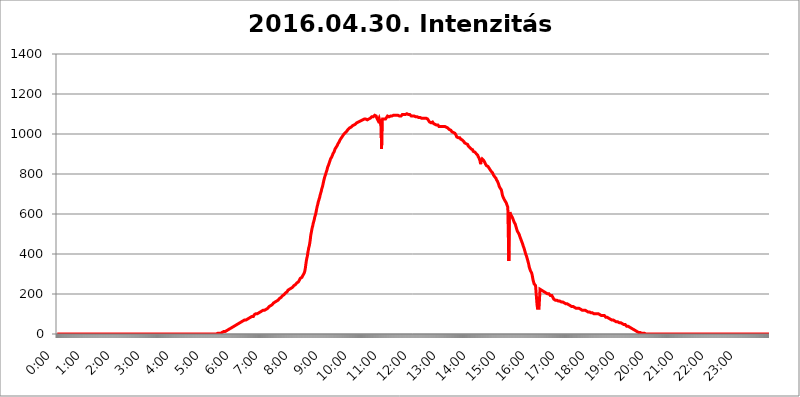
| Category | 2016.04.30. Intenzitás [W/m^2] |
|---|---|
| 0.0 | 0 |
| 0.0006944444444444445 | 0 |
| 0.001388888888888889 | 0 |
| 0.0020833333333333333 | 0 |
| 0.002777777777777778 | 0 |
| 0.003472222222222222 | 0 |
| 0.004166666666666667 | 0 |
| 0.004861111111111111 | 0 |
| 0.005555555555555556 | 0 |
| 0.0062499999999999995 | 0 |
| 0.006944444444444444 | 0 |
| 0.007638888888888889 | 0 |
| 0.008333333333333333 | 0 |
| 0.009027777777777779 | 0 |
| 0.009722222222222222 | 0 |
| 0.010416666666666666 | 0 |
| 0.011111111111111112 | 0 |
| 0.011805555555555555 | 0 |
| 0.012499999999999999 | 0 |
| 0.013194444444444444 | 0 |
| 0.013888888888888888 | 0 |
| 0.014583333333333332 | 0 |
| 0.015277777777777777 | 0 |
| 0.015972222222222224 | 0 |
| 0.016666666666666666 | 0 |
| 0.017361111111111112 | 0 |
| 0.018055555555555557 | 0 |
| 0.01875 | 0 |
| 0.019444444444444445 | 0 |
| 0.02013888888888889 | 0 |
| 0.020833333333333332 | 0 |
| 0.02152777777777778 | 0 |
| 0.022222222222222223 | 0 |
| 0.02291666666666667 | 0 |
| 0.02361111111111111 | 0 |
| 0.024305555555555556 | 0 |
| 0.024999999999999998 | 0 |
| 0.025694444444444447 | 0 |
| 0.02638888888888889 | 0 |
| 0.027083333333333334 | 0 |
| 0.027777777777777776 | 0 |
| 0.02847222222222222 | 0 |
| 0.029166666666666664 | 0 |
| 0.029861111111111113 | 0 |
| 0.030555555555555555 | 0 |
| 0.03125 | 0 |
| 0.03194444444444445 | 0 |
| 0.03263888888888889 | 0 |
| 0.03333333333333333 | 0 |
| 0.034027777777777775 | 0 |
| 0.034722222222222224 | 0 |
| 0.035416666666666666 | 0 |
| 0.036111111111111115 | 0 |
| 0.03680555555555556 | 0 |
| 0.0375 | 0 |
| 0.03819444444444444 | 0 |
| 0.03888888888888889 | 0 |
| 0.03958333333333333 | 0 |
| 0.04027777777777778 | 0 |
| 0.04097222222222222 | 0 |
| 0.041666666666666664 | 0 |
| 0.042361111111111106 | 0 |
| 0.04305555555555556 | 0 |
| 0.043750000000000004 | 0 |
| 0.044444444444444446 | 0 |
| 0.04513888888888889 | 0 |
| 0.04583333333333334 | 0 |
| 0.04652777777777778 | 0 |
| 0.04722222222222222 | 0 |
| 0.04791666666666666 | 0 |
| 0.04861111111111111 | 0 |
| 0.049305555555555554 | 0 |
| 0.049999999999999996 | 0 |
| 0.05069444444444445 | 0 |
| 0.051388888888888894 | 0 |
| 0.052083333333333336 | 0 |
| 0.05277777777777778 | 0 |
| 0.05347222222222222 | 0 |
| 0.05416666666666667 | 0 |
| 0.05486111111111111 | 0 |
| 0.05555555555555555 | 0 |
| 0.05625 | 0 |
| 0.05694444444444444 | 0 |
| 0.057638888888888885 | 0 |
| 0.05833333333333333 | 0 |
| 0.05902777777777778 | 0 |
| 0.059722222222222225 | 0 |
| 0.06041666666666667 | 0 |
| 0.061111111111111116 | 0 |
| 0.06180555555555556 | 0 |
| 0.0625 | 0 |
| 0.06319444444444444 | 0 |
| 0.06388888888888888 | 0 |
| 0.06458333333333334 | 0 |
| 0.06527777777777778 | 0 |
| 0.06597222222222222 | 0 |
| 0.06666666666666667 | 0 |
| 0.06736111111111111 | 0 |
| 0.06805555555555555 | 0 |
| 0.06874999999999999 | 0 |
| 0.06944444444444443 | 0 |
| 0.07013888888888889 | 0 |
| 0.07083333333333333 | 0 |
| 0.07152777777777779 | 0 |
| 0.07222222222222223 | 0 |
| 0.07291666666666667 | 0 |
| 0.07361111111111111 | 0 |
| 0.07430555555555556 | 0 |
| 0.075 | 0 |
| 0.07569444444444444 | 0 |
| 0.0763888888888889 | 0 |
| 0.07708333333333334 | 0 |
| 0.07777777777777778 | 0 |
| 0.07847222222222222 | 0 |
| 0.07916666666666666 | 0 |
| 0.0798611111111111 | 0 |
| 0.08055555555555556 | 0 |
| 0.08125 | 0 |
| 0.08194444444444444 | 0 |
| 0.08263888888888889 | 0 |
| 0.08333333333333333 | 0 |
| 0.08402777777777777 | 0 |
| 0.08472222222222221 | 0 |
| 0.08541666666666665 | 0 |
| 0.08611111111111112 | 0 |
| 0.08680555555555557 | 0 |
| 0.08750000000000001 | 0 |
| 0.08819444444444445 | 0 |
| 0.08888888888888889 | 0 |
| 0.08958333333333333 | 0 |
| 0.09027777777777778 | 0 |
| 0.09097222222222222 | 0 |
| 0.09166666666666667 | 0 |
| 0.09236111111111112 | 0 |
| 0.09305555555555556 | 0 |
| 0.09375 | 0 |
| 0.09444444444444444 | 0 |
| 0.09513888888888888 | 0 |
| 0.09583333333333333 | 0 |
| 0.09652777777777777 | 0 |
| 0.09722222222222222 | 0 |
| 0.09791666666666667 | 0 |
| 0.09861111111111111 | 0 |
| 0.09930555555555555 | 0 |
| 0.09999999999999999 | 0 |
| 0.10069444444444443 | 0 |
| 0.1013888888888889 | 0 |
| 0.10208333333333335 | 0 |
| 0.10277777777777779 | 0 |
| 0.10347222222222223 | 0 |
| 0.10416666666666667 | 0 |
| 0.10486111111111111 | 0 |
| 0.10555555555555556 | 0 |
| 0.10625 | 0 |
| 0.10694444444444444 | 0 |
| 0.1076388888888889 | 0 |
| 0.10833333333333334 | 0 |
| 0.10902777777777778 | 0 |
| 0.10972222222222222 | 0 |
| 0.1111111111111111 | 0 |
| 0.11180555555555556 | 0 |
| 0.11180555555555556 | 0 |
| 0.1125 | 0 |
| 0.11319444444444444 | 0 |
| 0.11388888888888889 | 0 |
| 0.11458333333333333 | 0 |
| 0.11527777777777777 | 0 |
| 0.11597222222222221 | 0 |
| 0.11666666666666665 | 0 |
| 0.1173611111111111 | 0 |
| 0.11805555555555557 | 0 |
| 0.11944444444444445 | 0 |
| 0.12013888888888889 | 0 |
| 0.12083333333333333 | 0 |
| 0.12152777777777778 | 0 |
| 0.12222222222222223 | 0 |
| 0.12291666666666667 | 0 |
| 0.12291666666666667 | 0 |
| 0.12361111111111112 | 0 |
| 0.12430555555555556 | 0 |
| 0.125 | 0 |
| 0.12569444444444444 | 0 |
| 0.12638888888888888 | 0 |
| 0.12708333333333333 | 0 |
| 0.16875 | 0 |
| 0.12847222222222224 | 0 |
| 0.12916666666666668 | 0 |
| 0.12986111111111112 | 0 |
| 0.13055555555555556 | 0 |
| 0.13125 | 0 |
| 0.13194444444444445 | 0 |
| 0.1326388888888889 | 0 |
| 0.13333333333333333 | 0 |
| 0.13402777777777777 | 0 |
| 0.13402777777777777 | 0 |
| 0.13472222222222222 | 0 |
| 0.13541666666666666 | 0 |
| 0.1361111111111111 | 0 |
| 0.13749999999999998 | 0 |
| 0.13819444444444443 | 0 |
| 0.1388888888888889 | 0 |
| 0.13958333333333334 | 0 |
| 0.14027777777777778 | 0 |
| 0.14097222222222222 | 0 |
| 0.14166666666666666 | 0 |
| 0.1423611111111111 | 0 |
| 0.14305555555555557 | 0 |
| 0.14375000000000002 | 0 |
| 0.14444444444444446 | 0 |
| 0.1451388888888889 | 0 |
| 0.1451388888888889 | 0 |
| 0.14652777777777778 | 0 |
| 0.14722222222222223 | 0 |
| 0.14791666666666667 | 0 |
| 0.1486111111111111 | 0 |
| 0.14930555555555555 | 0 |
| 0.15 | 0 |
| 0.15069444444444444 | 0 |
| 0.15138888888888888 | 0 |
| 0.15208333333333332 | 0 |
| 0.15277777777777776 | 0 |
| 0.15347222222222223 | 0 |
| 0.15416666666666667 | 0 |
| 0.15486111111111112 | 0 |
| 0.15555555555555556 | 0 |
| 0.15625 | 0 |
| 0.15694444444444444 | 0 |
| 0.15763888888888888 | 0 |
| 0.15833333333333333 | 0 |
| 0.15902777777777777 | 0 |
| 0.15972222222222224 | 0 |
| 0.16041666666666668 | 0 |
| 0.16111111111111112 | 0 |
| 0.16180555555555556 | 0 |
| 0.1625 | 0 |
| 0.16319444444444445 | 0 |
| 0.1638888888888889 | 0 |
| 0.16458333333333333 | 0 |
| 0.16527777777777777 | 0 |
| 0.16597222222222222 | 0 |
| 0.16666666666666666 | 0 |
| 0.1673611111111111 | 0 |
| 0.16805555555555554 | 0 |
| 0.16874999999999998 | 0 |
| 0.16944444444444443 | 0 |
| 0.17013888888888887 | 0 |
| 0.1708333333333333 | 0 |
| 0.17152777777777775 | 0 |
| 0.17222222222222225 | 0 |
| 0.1729166666666667 | 0 |
| 0.17361111111111113 | 0 |
| 0.17430555555555557 | 0 |
| 0.17500000000000002 | 0 |
| 0.17569444444444446 | 0 |
| 0.1763888888888889 | 0 |
| 0.17708333333333334 | 0 |
| 0.17777777777777778 | 0 |
| 0.17847222222222223 | 0 |
| 0.17916666666666667 | 0 |
| 0.1798611111111111 | 0 |
| 0.18055555555555555 | 0 |
| 0.18125 | 0 |
| 0.18194444444444444 | 0 |
| 0.1826388888888889 | 0 |
| 0.18333333333333335 | 0 |
| 0.1840277777777778 | 0 |
| 0.18472222222222223 | 0 |
| 0.18541666666666667 | 0 |
| 0.18611111111111112 | 0 |
| 0.18680555555555556 | 0 |
| 0.1875 | 0 |
| 0.18819444444444444 | 0 |
| 0.18888888888888888 | 0 |
| 0.18958333333333333 | 0 |
| 0.19027777777777777 | 0 |
| 0.1909722222222222 | 0 |
| 0.19166666666666665 | 0 |
| 0.19236111111111112 | 0 |
| 0.19305555555555554 | 0 |
| 0.19375 | 0 |
| 0.19444444444444445 | 0 |
| 0.1951388888888889 | 0 |
| 0.19583333333333333 | 0 |
| 0.19652777777777777 | 0 |
| 0.19722222222222222 | 0 |
| 0.19791666666666666 | 0 |
| 0.1986111111111111 | 0 |
| 0.19930555555555554 | 0 |
| 0.19999999999999998 | 0 |
| 0.20069444444444443 | 0 |
| 0.20138888888888887 | 0 |
| 0.2020833333333333 | 0 |
| 0.2027777777777778 | 0 |
| 0.2034722222222222 | 0 |
| 0.2041666666666667 | 0 |
| 0.20486111111111113 | 0 |
| 0.20555555555555557 | 0 |
| 0.20625000000000002 | 0 |
| 0.20694444444444446 | 0 |
| 0.2076388888888889 | 0 |
| 0.20833333333333334 | 0 |
| 0.20902777777777778 | 0 |
| 0.20972222222222223 | 0 |
| 0.21041666666666667 | 0 |
| 0.2111111111111111 | 0 |
| 0.21180555555555555 | 0 |
| 0.2125 | 0 |
| 0.21319444444444444 | 0 |
| 0.2138888888888889 | 0 |
| 0.21458333333333335 | 0 |
| 0.2152777777777778 | 0 |
| 0.21597222222222223 | 0 |
| 0.21666666666666667 | 0 |
| 0.21736111111111112 | 0 |
| 0.21805555555555556 | 0 |
| 0.21875 | 0 |
| 0.21944444444444444 | 0 |
| 0.22013888888888888 | 0 |
| 0.22083333333333333 | 0 |
| 0.22152777777777777 | 0 |
| 0.2222222222222222 | 0 |
| 0.22291666666666665 | 0 |
| 0.2236111111111111 | 0 |
| 0.22430555555555556 | 0 |
| 0.225 | 3.525 |
| 0.22569444444444445 | 3.525 |
| 0.2263888888888889 | 3.525 |
| 0.22708333333333333 | 3.525 |
| 0.22777777777777777 | 3.525 |
| 0.22847222222222222 | 3.525 |
| 0.22916666666666666 | 3.525 |
| 0.2298611111111111 | 3.525 |
| 0.23055555555555554 | 7.887 |
| 0.23124999999999998 | 7.887 |
| 0.23194444444444443 | 7.887 |
| 0.23263888888888887 | 12.257 |
| 0.2333333333333333 | 12.257 |
| 0.2340277777777778 | 12.257 |
| 0.2347222222222222 | 12.257 |
| 0.2354166666666667 | 12.257 |
| 0.23611111111111113 | 16.636 |
| 0.23680555555555557 | 16.636 |
| 0.23750000000000002 | 16.636 |
| 0.23819444444444446 | 21.024 |
| 0.2388888888888889 | 21.024 |
| 0.23958333333333334 | 21.024 |
| 0.24027777777777778 | 21.024 |
| 0.24097222222222223 | 25.419 |
| 0.24166666666666667 | 25.419 |
| 0.2423611111111111 | 29.823 |
| 0.24305555555555555 | 29.823 |
| 0.24375 | 29.823 |
| 0.24444444444444446 | 29.823 |
| 0.24513888888888888 | 34.234 |
| 0.24583333333333335 | 34.234 |
| 0.2465277777777778 | 34.234 |
| 0.24722222222222223 | 38.653 |
| 0.24791666666666667 | 38.653 |
| 0.24861111111111112 | 38.653 |
| 0.24930555555555556 | 43.079 |
| 0.25 | 43.079 |
| 0.25069444444444444 | 47.511 |
| 0.2513888888888889 | 47.511 |
| 0.2520833333333333 | 47.511 |
| 0.25277777777777777 | 47.511 |
| 0.2534722222222222 | 51.951 |
| 0.25416666666666665 | 51.951 |
| 0.2548611111111111 | 51.951 |
| 0.2555555555555556 | 56.398 |
| 0.25625000000000003 | 56.398 |
| 0.2569444444444445 | 56.398 |
| 0.2576388888888889 | 56.398 |
| 0.25833333333333336 | 60.85 |
| 0.2590277777777778 | 60.85 |
| 0.25972222222222224 | 65.31 |
| 0.2604166666666667 | 65.31 |
| 0.2611111111111111 | 65.31 |
| 0.26180555555555557 | 65.31 |
| 0.2625 | 69.775 |
| 0.26319444444444445 | 69.775 |
| 0.2638888888888889 | 69.775 |
| 0.26458333333333334 | 69.775 |
| 0.2652777777777778 | 74.246 |
| 0.2659722222222222 | 74.246 |
| 0.26666666666666666 | 74.246 |
| 0.2673611111111111 | 78.722 |
| 0.26805555555555555 | 78.722 |
| 0.26875 | 78.722 |
| 0.26944444444444443 | 83.205 |
| 0.2701388888888889 | 83.205 |
| 0.2708333333333333 | 83.205 |
| 0.27152777777777776 | 83.205 |
| 0.2722222222222222 | 87.692 |
| 0.27291666666666664 | 87.692 |
| 0.2736111111111111 | 87.692 |
| 0.2743055555555555 | 92.184 |
| 0.27499999999999997 | 87.692 |
| 0.27569444444444446 | 92.184 |
| 0.27638888888888885 | 96.682 |
| 0.27708333333333335 | 96.682 |
| 0.2777777777777778 | 96.682 |
| 0.27847222222222223 | 101.184 |
| 0.2791666666666667 | 101.184 |
| 0.2798611111111111 | 101.184 |
| 0.28055555555555556 | 101.184 |
| 0.28125 | 105.69 |
| 0.28194444444444444 | 105.69 |
| 0.2826388888888889 | 105.69 |
| 0.2833333333333333 | 110.201 |
| 0.28402777777777777 | 110.201 |
| 0.2847222222222222 | 110.201 |
| 0.28541666666666665 | 110.201 |
| 0.28611111111111115 | 114.716 |
| 0.28680555555555554 | 114.716 |
| 0.28750000000000003 | 114.716 |
| 0.2881944444444445 | 114.716 |
| 0.2888888888888889 | 119.235 |
| 0.28958333333333336 | 119.235 |
| 0.2902777777777778 | 119.235 |
| 0.29097222222222224 | 119.235 |
| 0.2916666666666667 | 123.758 |
| 0.2923611111111111 | 123.758 |
| 0.29305555555555557 | 123.758 |
| 0.29375 | 128.284 |
| 0.29444444444444445 | 128.284 |
| 0.2951388888888889 | 128.284 |
| 0.29583333333333334 | 132.814 |
| 0.2965277777777778 | 132.814 |
| 0.2972222222222222 | 137.347 |
| 0.29791666666666666 | 137.347 |
| 0.2986111111111111 | 141.884 |
| 0.29930555555555555 | 141.884 |
| 0.3 | 141.884 |
| 0.30069444444444443 | 146.423 |
| 0.3013888888888889 | 146.423 |
| 0.3020833333333333 | 150.964 |
| 0.30277777777777776 | 150.964 |
| 0.3034722222222222 | 155.509 |
| 0.30416666666666664 | 155.509 |
| 0.3048611111111111 | 155.509 |
| 0.3055555555555555 | 160.056 |
| 0.30624999999999997 | 160.056 |
| 0.3069444444444444 | 164.605 |
| 0.3076388888888889 | 164.605 |
| 0.30833333333333335 | 169.156 |
| 0.3090277777777778 | 169.156 |
| 0.30972222222222223 | 169.156 |
| 0.3104166666666667 | 173.709 |
| 0.3111111111111111 | 173.709 |
| 0.31180555555555556 | 178.264 |
| 0.3125 | 178.264 |
| 0.31319444444444444 | 182.82 |
| 0.3138888888888889 | 182.82 |
| 0.3145833333333333 | 187.378 |
| 0.31527777777777777 | 187.378 |
| 0.3159722222222222 | 191.937 |
| 0.31666666666666665 | 191.937 |
| 0.31736111111111115 | 191.937 |
| 0.31805555555555554 | 196.497 |
| 0.31875000000000003 | 201.058 |
| 0.3194444444444445 | 201.058 |
| 0.3201388888888889 | 205.62 |
| 0.32083333333333336 | 205.62 |
| 0.3215277777777778 | 210.182 |
| 0.32222222222222224 | 210.182 |
| 0.3229166666666667 | 214.746 |
| 0.3236111111111111 | 219.309 |
| 0.32430555555555557 | 219.309 |
| 0.325 | 219.309 |
| 0.32569444444444445 | 223.873 |
| 0.3263888888888889 | 223.873 |
| 0.32708333333333334 | 228.436 |
| 0.3277777777777778 | 228.436 |
| 0.3284722222222222 | 228.436 |
| 0.32916666666666666 | 233 |
| 0.3298611111111111 | 233 |
| 0.33055555555555555 | 237.564 |
| 0.33125 | 237.564 |
| 0.33194444444444443 | 242.127 |
| 0.3326388888888889 | 242.127 |
| 0.3333333333333333 | 242.127 |
| 0.3340277777777778 | 246.689 |
| 0.3347222222222222 | 251.251 |
| 0.3354166666666667 | 251.251 |
| 0.3361111111111111 | 255.813 |
| 0.3368055555555556 | 255.813 |
| 0.33749999999999997 | 260.373 |
| 0.33819444444444446 | 260.373 |
| 0.33888888888888885 | 264.932 |
| 0.33958333333333335 | 269.49 |
| 0.34027777777777773 | 274.047 |
| 0.34097222222222223 | 278.603 |
| 0.3416666666666666 | 278.603 |
| 0.3423611111111111 | 283.156 |
| 0.3430555555555555 | 283.156 |
| 0.34375 | 287.709 |
| 0.3444444444444445 | 292.259 |
| 0.3451388888888889 | 292.259 |
| 0.3458333333333334 | 296.808 |
| 0.34652777777777777 | 305.898 |
| 0.34722222222222227 | 314.98 |
| 0.34791666666666665 | 328.584 |
| 0.34861111111111115 | 346.682 |
| 0.34930555555555554 | 364.728 |
| 0.35000000000000003 | 378.224 |
| 0.3506944444444444 | 387.202 |
| 0.3513888888888889 | 405.108 |
| 0.3520833333333333 | 418.492 |
| 0.3527777777777778 | 431.833 |
| 0.3534722222222222 | 440.702 |
| 0.3541666666666667 | 453.968 |
| 0.3548611111111111 | 471.582 |
| 0.35555555555555557 | 493.475 |
| 0.35625 | 506.542 |
| 0.35694444444444445 | 519.555 |
| 0.3576388888888889 | 532.513 |
| 0.35833333333333334 | 541.121 |
| 0.3590277777777778 | 553.986 |
| 0.3597222222222222 | 562.53 |
| 0.36041666666666666 | 571.049 |
| 0.3611111111111111 | 583.779 |
| 0.36180555555555555 | 592.233 |
| 0.3625 | 600.661 |
| 0.36319444444444443 | 613.252 |
| 0.3638888888888889 | 625.784 |
| 0.3645833333333333 | 638.256 |
| 0.3652777777777778 | 646.537 |
| 0.3659722222222222 | 658.909 |
| 0.3666666666666667 | 667.123 |
| 0.3673611111111111 | 675.311 |
| 0.3680555555555556 | 683.473 |
| 0.36874999999999997 | 695.666 |
| 0.36944444444444446 | 703.762 |
| 0.37013888888888885 | 711.832 |
| 0.37083333333333335 | 723.889 |
| 0.37152777777777773 | 731.896 |
| 0.37222222222222223 | 739.877 |
| 0.3729166666666666 | 751.803 |
| 0.3736111111111111 | 763.674 |
| 0.3743055555555555 | 767.62 |
| 0.375 | 783.342 |
| 0.3756944444444445 | 791.169 |
| 0.3763888888888889 | 798.974 |
| 0.3770833333333334 | 806.757 |
| 0.37777777777777777 | 814.519 |
| 0.37847222222222227 | 822.26 |
| 0.37916666666666665 | 833.834 |
| 0.37986111111111115 | 837.682 |
| 0.38055555555555554 | 845.365 |
| 0.38125000000000003 | 853.029 |
| 0.3819444444444444 | 860.676 |
| 0.3826388888888889 | 868.305 |
| 0.3833333333333333 | 875.918 |
| 0.3840277777777778 | 879.719 |
| 0.3847222222222222 | 883.516 |
| 0.3854166666666667 | 887.309 |
| 0.3861111111111111 | 894.885 |
| 0.38680555555555557 | 902.447 |
| 0.3875 | 906.223 |
| 0.38819444444444445 | 909.996 |
| 0.3888888888888889 | 917.534 |
| 0.38958333333333334 | 925.06 |
| 0.3902777777777778 | 925.06 |
| 0.3909722222222222 | 932.576 |
| 0.39166666666666666 | 936.33 |
| 0.3923611111111111 | 940.082 |
| 0.39305555555555555 | 943.832 |
| 0.39375 | 951.327 |
| 0.39444444444444443 | 955.071 |
| 0.3951388888888889 | 958.814 |
| 0.3958333333333333 | 962.555 |
| 0.3965277777777778 | 970.034 |
| 0.3972222222222222 | 973.772 |
| 0.3979166666666667 | 977.508 |
| 0.3986111111111111 | 981.244 |
| 0.3993055555555556 | 984.98 |
| 0.39999999999999997 | 988.714 |
| 0.40069444444444446 | 992.448 |
| 0.40138888888888885 | 996.182 |
| 0.40208333333333335 | 999.916 |
| 0.40277777777777773 | 999.916 |
| 0.40347222222222223 | 1003.65 |
| 0.4041666666666666 | 1007.383 |
| 0.4048611111111111 | 1011.118 |
| 0.4055555555555555 | 1011.118 |
| 0.40625 | 1014.852 |
| 0.4069444444444445 | 1018.587 |
| 0.4076388888888889 | 1022.323 |
| 0.4083333333333334 | 1022.323 |
| 0.40902777777777777 | 1022.323 |
| 0.40972222222222227 | 1029.798 |
| 0.41041666666666665 | 1029.798 |
| 0.41111111111111115 | 1029.798 |
| 0.41180555555555554 | 1033.537 |
| 0.41250000000000003 | 1037.277 |
| 0.4131944444444444 | 1037.277 |
| 0.4138888888888889 | 1041.019 |
| 0.4145833333333333 | 1041.019 |
| 0.4152777777777778 | 1041.019 |
| 0.4159722222222222 | 1044.762 |
| 0.4166666666666667 | 1044.762 |
| 0.4173611111111111 | 1044.762 |
| 0.41805555555555557 | 1048.508 |
| 0.41875 | 1048.508 |
| 0.41944444444444445 | 1052.255 |
| 0.4201388888888889 | 1056.004 |
| 0.42083333333333334 | 1056.004 |
| 0.4215277777777778 | 1059.756 |
| 0.4222222222222222 | 1059.756 |
| 0.42291666666666666 | 1059.756 |
| 0.4236111111111111 | 1063.51 |
| 0.42430555555555555 | 1063.51 |
| 0.425 | 1063.51 |
| 0.42569444444444443 | 1067.267 |
| 0.4263888888888889 | 1067.267 |
| 0.4270833333333333 | 1067.267 |
| 0.4277777777777778 | 1067.267 |
| 0.4284722222222222 | 1071.027 |
| 0.4291666666666667 | 1071.027 |
| 0.4298611111111111 | 1074.789 |
| 0.4305555555555556 | 1074.789 |
| 0.43124999999999997 | 1074.789 |
| 0.43194444444444446 | 1074.789 |
| 0.43263888888888885 | 1074.789 |
| 0.43333333333333335 | 1071.027 |
| 0.43402777777777773 | 1071.027 |
| 0.43472222222222223 | 1071.027 |
| 0.4354166666666666 | 1074.789 |
| 0.4361111111111111 | 1074.789 |
| 0.4368055555555555 | 1074.789 |
| 0.4375 | 1074.789 |
| 0.4381944444444445 | 1074.789 |
| 0.4388888888888889 | 1078.555 |
| 0.4395833333333334 | 1078.555 |
| 0.44027777777777777 | 1078.555 |
| 0.44097222222222227 | 1086.097 |
| 0.44166666666666665 | 1086.097 |
| 0.44236111111111115 | 1086.097 |
| 0.44305555555555554 | 1086.097 |
| 0.44375000000000003 | 1082.324 |
| 0.4444444444444444 | 1086.097 |
| 0.4451388888888889 | 1093.653 |
| 0.4458333333333333 | 1093.653 |
| 0.4465277777777778 | 1093.653 |
| 0.4472222222222222 | 1089.873 |
| 0.4479166666666667 | 1082.324 |
| 0.4486111111111111 | 1082.324 |
| 0.44930555555555557 | 1078.555 |
| 0.45 | 1067.267 |
| 0.45069444444444445 | 1071.027 |
| 0.4513888888888889 | 1078.555 |
| 0.45208333333333334 | 1082.324 |
| 0.4527777777777778 | 1059.756 |
| 0.4534722222222222 | 1059.756 |
| 0.45416666666666666 | 1071.027 |
| 0.4548611111111111 | 925.06 |
| 0.45555555555555555 | 1063.51 |
| 0.45625 | 1074.789 |
| 0.45694444444444443 | 1078.555 |
| 0.4576388888888889 | 1074.789 |
| 0.4583333333333333 | 1074.789 |
| 0.4590277777777778 | 1074.789 |
| 0.4597222222222222 | 1074.789 |
| 0.4604166666666667 | 1074.789 |
| 0.4611111111111111 | 1078.555 |
| 0.4618055555555556 | 1082.324 |
| 0.46249999999999997 | 1086.097 |
| 0.46319444444444446 | 1089.873 |
| 0.46388888888888885 | 1093.653 |
| 0.46458333333333335 | 1086.097 |
| 0.46527777777777773 | 1086.097 |
| 0.46597222222222223 | 1086.097 |
| 0.4666666666666666 | 1089.873 |
| 0.4673611111111111 | 1089.873 |
| 0.4680555555555555 | 1089.873 |
| 0.46875 | 1089.873 |
| 0.4694444444444445 | 1089.873 |
| 0.4701388888888889 | 1093.653 |
| 0.4708333333333334 | 1093.653 |
| 0.47152777777777777 | 1093.653 |
| 0.47222222222222227 | 1093.653 |
| 0.47291666666666665 | 1093.653 |
| 0.47361111111111115 | 1093.653 |
| 0.47430555555555554 | 1097.437 |
| 0.47500000000000003 | 1093.653 |
| 0.4756944444444444 | 1093.653 |
| 0.4763888888888889 | 1093.653 |
| 0.4770833333333333 | 1093.653 |
| 0.4777777777777778 | 1093.653 |
| 0.4784722222222222 | 1089.873 |
| 0.4791666666666667 | 1093.653 |
| 0.4798611111111111 | 1089.873 |
| 0.48055555555555557 | 1086.097 |
| 0.48125 | 1089.873 |
| 0.48194444444444445 | 1089.873 |
| 0.4826388888888889 | 1093.653 |
| 0.48333333333333334 | 1093.653 |
| 0.4840277777777778 | 1097.437 |
| 0.4847222222222222 | 1093.653 |
| 0.48541666666666666 | 1097.437 |
| 0.4861111111111111 | 1097.437 |
| 0.48680555555555555 | 1101.226 |
| 0.4875 | 1097.437 |
| 0.48819444444444443 | 1097.437 |
| 0.4888888888888889 | 1101.226 |
| 0.4895833333333333 | 1101.226 |
| 0.4902777777777778 | 1101.226 |
| 0.4909722222222222 | 1101.226 |
| 0.4916666666666667 | 1097.437 |
| 0.4923611111111111 | 1097.437 |
| 0.4930555555555556 | 1101.226 |
| 0.49374999999999997 | 1097.437 |
| 0.49444444444444446 | 1097.437 |
| 0.49513888888888885 | 1093.653 |
| 0.49583333333333335 | 1093.653 |
| 0.49652777777777773 | 1089.873 |
| 0.49722222222222223 | 1089.873 |
| 0.4979166666666666 | 1089.873 |
| 0.4986111111111111 | 1089.873 |
| 0.4993055555555555 | 1089.873 |
| 0.5 | 1089.873 |
| 0.5006944444444444 | 1089.873 |
| 0.5013888888888889 | 1089.873 |
| 0.5020833333333333 | 1086.097 |
| 0.5027777777777778 | 1086.097 |
| 0.5034722222222222 | 1086.097 |
| 0.5041666666666667 | 1086.097 |
| 0.5048611111111111 | 1086.097 |
| 0.5055555555555555 | 1086.097 |
| 0.50625 | 1082.324 |
| 0.5069444444444444 | 1082.324 |
| 0.5076388888888889 | 1082.324 |
| 0.5083333333333333 | 1082.324 |
| 0.5090277777777777 | 1082.324 |
| 0.5097222222222222 | 1082.324 |
| 0.5104166666666666 | 1082.324 |
| 0.5111111111111112 | 1078.555 |
| 0.5118055555555555 | 1078.555 |
| 0.5125000000000001 | 1078.555 |
| 0.5131944444444444 | 1078.555 |
| 0.513888888888889 | 1082.324 |
| 0.5145833333333333 | 1082.324 |
| 0.5152777777777778 | 1078.555 |
| 0.5159722222222222 | 1082.324 |
| 0.5166666666666667 | 1078.555 |
| 0.517361111111111 | 1078.555 |
| 0.5180555555555556 | 1078.555 |
| 0.5187499999999999 | 1074.789 |
| 0.5194444444444445 | 1074.789 |
| 0.5201388888888888 | 1071.027 |
| 0.5208333333333334 | 1067.267 |
| 0.5215277777777778 | 1063.51 |
| 0.5222222222222223 | 1059.756 |
| 0.5229166666666667 | 1056.004 |
| 0.5236111111111111 | 1056.004 |
| 0.5243055555555556 | 1056.004 |
| 0.525 | 1059.756 |
| 0.5256944444444445 | 1056.004 |
| 0.5263888888888889 | 1059.756 |
| 0.5270833333333333 | 1056.004 |
| 0.5277777777777778 | 1052.255 |
| 0.5284722222222222 | 1048.508 |
| 0.5291666666666667 | 1048.508 |
| 0.5298611111111111 | 1048.508 |
| 0.5305555555555556 | 1048.508 |
| 0.53125 | 1048.508 |
| 0.5319444444444444 | 1044.762 |
| 0.5326388888888889 | 1044.762 |
| 0.5333333333333333 | 1044.762 |
| 0.5340277777777778 | 1044.762 |
| 0.5347222222222222 | 1041.019 |
| 0.5354166666666667 | 1037.277 |
| 0.5361111111111111 | 1037.277 |
| 0.5368055555555555 | 1037.277 |
| 0.5375 | 1037.277 |
| 0.5381944444444444 | 1041.019 |
| 0.5388888888888889 | 1037.277 |
| 0.5395833333333333 | 1037.277 |
| 0.5402777777777777 | 1037.277 |
| 0.5409722222222222 | 1037.277 |
| 0.5416666666666666 | 1037.277 |
| 0.5423611111111112 | 1033.537 |
| 0.5430555555555555 | 1033.537 |
| 0.5437500000000001 | 1037.277 |
| 0.5444444444444444 | 1033.537 |
| 0.545138888888889 | 1033.537 |
| 0.5458333333333333 | 1033.537 |
| 0.5465277777777778 | 1033.537 |
| 0.5472222222222222 | 1029.798 |
| 0.5479166666666667 | 1029.798 |
| 0.548611111111111 | 1029.798 |
| 0.5493055555555556 | 1026.06 |
| 0.5499999999999999 | 1022.323 |
| 0.5506944444444445 | 1022.323 |
| 0.5513888888888888 | 1022.323 |
| 0.5520833333333334 | 1018.587 |
| 0.5527777777777778 | 1014.852 |
| 0.5534722222222223 | 1011.118 |
| 0.5541666666666667 | 1014.852 |
| 0.5548611111111111 | 1007.383 |
| 0.5555555555555556 | 1007.383 |
| 0.55625 | 1007.383 |
| 0.5569444444444445 | 1003.65 |
| 0.5576388888888889 | 1003.65 |
| 0.5583333333333333 | 999.916 |
| 0.5590277777777778 | 996.182 |
| 0.5597222222222222 | 992.448 |
| 0.5604166666666667 | 984.98 |
| 0.5611111111111111 | 984.98 |
| 0.5618055555555556 | 984.98 |
| 0.5625 | 981.244 |
| 0.5631944444444444 | 981.244 |
| 0.5638888888888889 | 977.508 |
| 0.5645833333333333 | 981.244 |
| 0.5652777777777778 | 977.508 |
| 0.5659722222222222 | 973.772 |
| 0.5666666666666667 | 973.772 |
| 0.5673611111111111 | 970.034 |
| 0.5680555555555555 | 970.034 |
| 0.56875 | 970.034 |
| 0.5694444444444444 | 966.295 |
| 0.5701388888888889 | 962.555 |
| 0.5708333333333333 | 958.814 |
| 0.5715277777777777 | 955.071 |
| 0.5722222222222222 | 955.071 |
| 0.5729166666666666 | 951.327 |
| 0.5736111111111112 | 951.327 |
| 0.5743055555555555 | 951.327 |
| 0.5750000000000001 | 947.58 |
| 0.5756944444444444 | 947.58 |
| 0.576388888888889 | 940.082 |
| 0.5770833333333333 | 940.082 |
| 0.5777777777777778 | 936.33 |
| 0.5784722222222222 | 932.576 |
| 0.5791666666666667 | 932.576 |
| 0.579861111111111 | 932.576 |
| 0.5805555555555556 | 925.06 |
| 0.5812499999999999 | 925.06 |
| 0.5819444444444445 | 921.298 |
| 0.5826388888888888 | 921.298 |
| 0.5833333333333334 | 913.766 |
| 0.5840277777777778 | 913.766 |
| 0.5847222222222223 | 913.766 |
| 0.5854166666666667 | 909.996 |
| 0.5861111111111111 | 909.996 |
| 0.5868055555555556 | 906.223 |
| 0.5875 | 902.447 |
| 0.5881944444444445 | 898.668 |
| 0.5888888888888889 | 898.668 |
| 0.5895833333333333 | 894.885 |
| 0.5902777777777778 | 887.309 |
| 0.5909722222222222 | 887.309 |
| 0.5916666666666667 | 879.719 |
| 0.5923611111111111 | 875.918 |
| 0.5930555555555556 | 864.493 |
| 0.59375 | 849.199 |
| 0.5944444444444444 | 868.305 |
| 0.5951388888888889 | 872.114 |
| 0.5958333333333333 | 875.918 |
| 0.5965277777777778 | 872.114 |
| 0.5972222222222222 | 872.114 |
| 0.5979166666666667 | 868.305 |
| 0.5986111111111111 | 864.493 |
| 0.5993055555555555 | 860.676 |
| 0.6 | 856.855 |
| 0.6006944444444444 | 849.199 |
| 0.6013888888888889 | 845.365 |
| 0.6020833333333333 | 841.526 |
| 0.6027777777777777 | 841.526 |
| 0.6034722222222222 | 841.526 |
| 0.6041666666666666 | 837.682 |
| 0.6048611111111112 | 833.834 |
| 0.6055555555555555 | 829.981 |
| 0.6062500000000001 | 829.981 |
| 0.6069444444444444 | 822.26 |
| 0.607638888888889 | 818.392 |
| 0.6083333333333333 | 814.519 |
| 0.6090277777777778 | 810.641 |
| 0.6097222222222222 | 810.641 |
| 0.6104166666666667 | 806.757 |
| 0.611111111111111 | 802.868 |
| 0.6118055555555556 | 795.074 |
| 0.6124999999999999 | 791.169 |
| 0.6131944444444445 | 787.258 |
| 0.6138888888888888 | 783.342 |
| 0.6145833333333334 | 783.342 |
| 0.6152777777777778 | 779.42 |
| 0.6159722222222223 | 771.559 |
| 0.6166666666666667 | 767.62 |
| 0.6173611111111111 | 763.674 |
| 0.6180555555555556 | 759.723 |
| 0.61875 | 751.803 |
| 0.6194444444444445 | 743.859 |
| 0.6201388888888889 | 735.89 |
| 0.6208333333333333 | 735.89 |
| 0.6215277777777778 | 727.896 |
| 0.6222222222222222 | 727.896 |
| 0.6229166666666667 | 719.877 |
| 0.6236111111111111 | 715.858 |
| 0.6243055555555556 | 695.666 |
| 0.625 | 687.544 |
| 0.6256944444444444 | 683.473 |
| 0.6263888888888889 | 683.473 |
| 0.6270833333333333 | 671.22 |
| 0.6277777777777778 | 667.123 |
| 0.6284722222222222 | 663.019 |
| 0.6291666666666667 | 658.909 |
| 0.6298611111111111 | 654.791 |
| 0.6305555555555555 | 646.537 |
| 0.63125 | 642.4 |
| 0.6319444444444444 | 634.105 |
| 0.6326388888888889 | 629.948 |
| 0.6333333333333333 | 364.728 |
| 0.6340277777777777 | 592.233 |
| 0.6347222222222222 | 609.062 |
| 0.6354166666666666 | 600.661 |
| 0.6361111111111112 | 596.45 |
| 0.6368055555555555 | 592.233 |
| 0.6375000000000001 | 588.009 |
| 0.6381944444444444 | 583.779 |
| 0.638888888888889 | 579.542 |
| 0.6395833333333333 | 571.049 |
| 0.6402777777777778 | 566.793 |
| 0.6409722222222222 | 558.261 |
| 0.6416666666666667 | 553.986 |
| 0.642361111111111 | 549.704 |
| 0.6430555555555556 | 541.121 |
| 0.6437499999999999 | 532.513 |
| 0.6444444444444445 | 523.88 |
| 0.6451388888888888 | 515.223 |
| 0.6458333333333334 | 510.885 |
| 0.6465277777777778 | 506.542 |
| 0.6472222222222223 | 506.542 |
| 0.6479166666666667 | 497.836 |
| 0.6486111111111111 | 489.108 |
| 0.6493055555555556 | 484.735 |
| 0.65 | 475.972 |
| 0.6506944444444445 | 471.582 |
| 0.6513888888888889 | 462.786 |
| 0.6520833333333333 | 458.38 |
| 0.6527777777777778 | 449.551 |
| 0.6534722222222222 | 440.702 |
| 0.6541666666666667 | 436.27 |
| 0.6548611111111111 | 427.39 |
| 0.6555555555555556 | 418.492 |
| 0.65625 | 409.574 |
| 0.6569444444444444 | 400.638 |
| 0.6576388888888889 | 396.164 |
| 0.6583333333333333 | 387.202 |
| 0.6590277777777778 | 378.224 |
| 0.6597222222222222 | 369.23 |
| 0.6604166666666667 | 360.221 |
| 0.6611111111111111 | 351.198 |
| 0.6618055555555555 | 337.639 |
| 0.6625 | 328.584 |
| 0.6631944444444444 | 324.052 |
| 0.6638888888888889 | 314.98 |
| 0.6645833333333333 | 310.44 |
| 0.6652777777777777 | 305.898 |
| 0.6659722222222222 | 296.808 |
| 0.6666666666666666 | 283.156 |
| 0.6673611111111111 | 269.49 |
| 0.6680555555555556 | 260.373 |
| 0.6687500000000001 | 251.251 |
| 0.6694444444444444 | 246.689 |
| 0.6701388888888888 | 246.689 |
| 0.6708333333333334 | 242.127 |
| 0.6715277777777778 | 242.127 |
| 0.6722222222222222 | 237.564 |
| 0.6729166666666666 | 146.423 |
| 0.6736111111111112 | 128.284 |
| 0.6743055555555556 | 128.284 |
| 0.6749999999999999 | 132.814 |
| 0.6756944444444444 | 128.284 |
| 0.6763888888888889 | 132.814 |
| 0.6770833333333334 | 223.873 |
| 0.6777777777777777 | 228.436 |
| 0.6784722222222223 | 223.873 |
| 0.6791666666666667 | 219.309 |
| 0.6798611111111111 | 219.309 |
| 0.6805555555555555 | 219.309 |
| 0.68125 | 214.746 |
| 0.6819444444444445 | 214.746 |
| 0.6826388888888889 | 214.746 |
| 0.6833333333333332 | 210.182 |
| 0.6840277777777778 | 210.182 |
| 0.6847222222222222 | 210.182 |
| 0.6854166666666667 | 205.62 |
| 0.686111111111111 | 205.62 |
| 0.6868055555555556 | 205.62 |
| 0.6875 | 201.058 |
| 0.6881944444444444 | 201.058 |
| 0.688888888888889 | 201.058 |
| 0.6895833333333333 | 201.058 |
| 0.6902777777777778 | 196.497 |
| 0.6909722222222222 | 196.497 |
| 0.6916666666666668 | 191.937 |
| 0.6923611111111111 | 191.937 |
| 0.6930555555555555 | 191.937 |
| 0.69375 | 191.937 |
| 0.6944444444444445 | 191.937 |
| 0.6951388888888889 | 182.82 |
| 0.6958333333333333 | 178.264 |
| 0.6965277777777777 | 173.709 |
| 0.6972222222222223 | 173.709 |
| 0.6979166666666666 | 173.709 |
| 0.6986111111111111 | 169.156 |
| 0.6993055555555556 | 169.156 |
| 0.7000000000000001 | 169.156 |
| 0.7006944444444444 | 169.156 |
| 0.7013888888888888 | 164.605 |
| 0.7020833333333334 | 164.605 |
| 0.7027777777777778 | 164.605 |
| 0.7034722222222222 | 164.605 |
| 0.7041666666666666 | 164.605 |
| 0.7048611111111112 | 164.605 |
| 0.7055555555555556 | 164.605 |
| 0.7062499999999999 | 164.605 |
| 0.7069444444444444 | 160.056 |
| 0.7076388888888889 | 160.056 |
| 0.7083333333333334 | 160.056 |
| 0.7090277777777777 | 160.056 |
| 0.7097222222222223 | 155.509 |
| 0.7104166666666667 | 155.509 |
| 0.7111111111111111 | 155.509 |
| 0.7118055555555555 | 155.509 |
| 0.7125 | 155.509 |
| 0.7131944444444445 | 150.964 |
| 0.7138888888888889 | 150.964 |
| 0.7145833333333332 | 150.964 |
| 0.7152777777777778 | 150.964 |
| 0.7159722222222222 | 146.423 |
| 0.7166666666666667 | 146.423 |
| 0.717361111111111 | 146.423 |
| 0.7180555555555556 | 146.423 |
| 0.71875 | 146.423 |
| 0.7194444444444444 | 141.884 |
| 0.720138888888889 | 141.884 |
| 0.7208333333333333 | 141.884 |
| 0.7215277777777778 | 137.347 |
| 0.7222222222222222 | 137.347 |
| 0.7229166666666668 | 137.347 |
| 0.7236111111111111 | 137.347 |
| 0.7243055555555555 | 137.347 |
| 0.725 | 137.347 |
| 0.7256944444444445 | 132.814 |
| 0.7263888888888889 | 132.814 |
| 0.7270833333333333 | 132.814 |
| 0.7277777777777777 | 128.284 |
| 0.7284722222222223 | 128.284 |
| 0.7291666666666666 | 128.284 |
| 0.7298611111111111 | 128.284 |
| 0.7305555555555556 | 128.284 |
| 0.7312500000000001 | 128.284 |
| 0.7319444444444444 | 128.284 |
| 0.7326388888888888 | 123.758 |
| 0.7333333333333334 | 123.758 |
| 0.7340277777777778 | 123.758 |
| 0.7347222222222222 | 123.758 |
| 0.7354166666666666 | 123.758 |
| 0.7361111111111112 | 119.235 |
| 0.7368055555555556 | 119.235 |
| 0.7374999999999999 | 119.235 |
| 0.7381944444444444 | 119.235 |
| 0.7388888888888889 | 119.235 |
| 0.7395833333333334 | 119.235 |
| 0.7402777777777777 | 119.235 |
| 0.7409722222222223 | 114.716 |
| 0.7416666666666667 | 114.716 |
| 0.7423611111111111 | 114.716 |
| 0.7430555555555555 | 114.716 |
| 0.74375 | 114.716 |
| 0.7444444444444445 | 110.201 |
| 0.7451388888888889 | 110.201 |
| 0.7458333333333332 | 110.201 |
| 0.7465277777777778 | 110.201 |
| 0.7472222222222222 | 110.201 |
| 0.7479166666666667 | 110.201 |
| 0.748611111111111 | 105.69 |
| 0.7493055555555556 | 105.69 |
| 0.75 | 105.69 |
| 0.7506944444444444 | 105.69 |
| 0.751388888888889 | 105.69 |
| 0.7520833333333333 | 105.69 |
| 0.7527777777777778 | 101.184 |
| 0.7534722222222222 | 101.184 |
| 0.7541666666666668 | 101.184 |
| 0.7548611111111111 | 101.184 |
| 0.7555555555555555 | 101.184 |
| 0.75625 | 101.184 |
| 0.7569444444444445 | 101.184 |
| 0.7576388888888889 | 101.184 |
| 0.7583333333333333 | 101.184 |
| 0.7590277777777777 | 101.184 |
| 0.7597222222222223 | 101.184 |
| 0.7604166666666666 | 96.682 |
| 0.7611111111111111 | 96.682 |
| 0.7618055555555556 | 96.682 |
| 0.7625000000000001 | 96.682 |
| 0.7631944444444444 | 92.184 |
| 0.7638888888888888 | 92.184 |
| 0.7645833333333334 | 92.184 |
| 0.7652777777777778 | 92.184 |
| 0.7659722222222222 | 92.184 |
| 0.7666666666666666 | 92.184 |
| 0.7673611111111112 | 92.184 |
| 0.7680555555555556 | 87.692 |
| 0.7687499999999999 | 87.692 |
| 0.7694444444444444 | 83.205 |
| 0.7701388888888889 | 83.205 |
| 0.7708333333333334 | 83.205 |
| 0.7715277777777777 | 83.205 |
| 0.7722222222222223 | 83.205 |
| 0.7729166666666667 | 78.722 |
| 0.7736111111111111 | 78.722 |
| 0.7743055555555555 | 78.722 |
| 0.775 | 74.246 |
| 0.7756944444444445 | 74.246 |
| 0.7763888888888889 | 74.246 |
| 0.7770833333333332 | 74.246 |
| 0.7777777777777778 | 69.775 |
| 0.7784722222222222 | 69.775 |
| 0.7791666666666667 | 69.775 |
| 0.779861111111111 | 69.775 |
| 0.7805555555555556 | 65.31 |
| 0.78125 | 65.31 |
| 0.7819444444444444 | 65.31 |
| 0.782638888888889 | 65.31 |
| 0.7833333333333333 | 65.31 |
| 0.7840277777777778 | 60.85 |
| 0.7847222222222222 | 60.85 |
| 0.7854166666666668 | 60.85 |
| 0.7861111111111111 | 60.85 |
| 0.7868055555555555 | 56.398 |
| 0.7875 | 56.398 |
| 0.7881944444444445 | 56.398 |
| 0.7888888888888889 | 56.398 |
| 0.7895833333333333 | 56.398 |
| 0.7902777777777777 | 56.398 |
| 0.7909722222222223 | 51.951 |
| 0.7916666666666666 | 51.951 |
| 0.7923611111111111 | 51.951 |
| 0.7930555555555556 | 51.951 |
| 0.7937500000000001 | 51.951 |
| 0.7944444444444444 | 47.511 |
| 0.7951388888888888 | 47.511 |
| 0.7958333333333334 | 47.511 |
| 0.7965277777777778 | 47.511 |
| 0.7972222222222222 | 43.079 |
| 0.7979166666666666 | 43.079 |
| 0.7986111111111112 | 38.653 |
| 0.7993055555555556 | 38.653 |
| 0.7999999999999999 | 38.653 |
| 0.8006944444444444 | 38.653 |
| 0.8013888888888889 | 34.234 |
| 0.8020833333333334 | 34.234 |
| 0.8027777777777777 | 34.234 |
| 0.8034722222222223 | 29.823 |
| 0.8041666666666667 | 29.823 |
| 0.8048611111111111 | 29.823 |
| 0.8055555555555555 | 25.419 |
| 0.80625 | 25.419 |
| 0.8069444444444445 | 25.419 |
| 0.8076388888888889 | 25.419 |
| 0.8083333333333332 | 21.024 |
| 0.8090277777777778 | 21.024 |
| 0.8097222222222222 | 21.024 |
| 0.8104166666666667 | 16.636 |
| 0.811111111111111 | 16.636 |
| 0.8118055555555556 | 12.257 |
| 0.8125 | 12.257 |
| 0.8131944444444444 | 12.257 |
| 0.813888888888889 | 12.257 |
| 0.8145833333333333 | 12.257 |
| 0.8152777777777778 | 7.887 |
| 0.8159722222222222 | 7.887 |
| 0.8166666666666668 | 7.887 |
| 0.8173611111111111 | 7.887 |
| 0.8180555555555555 | 3.525 |
| 0.81875 | 3.525 |
| 0.8194444444444445 | 3.525 |
| 0.8201388888888889 | 3.525 |
| 0.8208333333333333 | 3.525 |
| 0.8215277777777777 | 3.525 |
| 0.8222222222222223 | 3.525 |
| 0.8229166666666666 | 3.525 |
| 0.8236111111111111 | 3.525 |
| 0.8243055555555556 | 0 |
| 0.8250000000000001 | 0 |
| 0.8256944444444444 | 0 |
| 0.8263888888888888 | 0 |
| 0.8270833333333334 | 0 |
| 0.8277777777777778 | 0 |
| 0.8284722222222222 | 0 |
| 0.8291666666666666 | 0 |
| 0.8298611111111112 | 0 |
| 0.8305555555555556 | 0 |
| 0.8312499999999999 | 0 |
| 0.8319444444444444 | 0 |
| 0.8326388888888889 | 0 |
| 0.8333333333333334 | 0 |
| 0.8340277777777777 | 0 |
| 0.8347222222222223 | 0 |
| 0.8354166666666667 | 0 |
| 0.8361111111111111 | 0 |
| 0.8368055555555555 | 0 |
| 0.8375 | 0 |
| 0.8381944444444445 | 0 |
| 0.8388888888888889 | 0 |
| 0.8395833333333332 | 0 |
| 0.8402777777777778 | 0 |
| 0.8409722222222222 | 0 |
| 0.8416666666666667 | 0 |
| 0.842361111111111 | 0 |
| 0.8430555555555556 | 0 |
| 0.84375 | 0 |
| 0.8444444444444444 | 0 |
| 0.845138888888889 | 0 |
| 0.8458333333333333 | 0 |
| 0.8465277777777778 | 0 |
| 0.8472222222222222 | 0 |
| 0.8479166666666668 | 0 |
| 0.8486111111111111 | 0 |
| 0.8493055555555555 | 0 |
| 0.85 | 0 |
| 0.8506944444444445 | 0 |
| 0.8513888888888889 | 0 |
| 0.8520833333333333 | 0 |
| 0.8527777777777777 | 0 |
| 0.8534722222222223 | 0 |
| 0.8541666666666666 | 0 |
| 0.8548611111111111 | 0 |
| 0.8555555555555556 | 0 |
| 0.8562500000000001 | 0 |
| 0.8569444444444444 | 0 |
| 0.8576388888888888 | 0 |
| 0.8583333333333334 | 0 |
| 0.8590277777777778 | 0 |
| 0.8597222222222222 | 0 |
| 0.8604166666666666 | 0 |
| 0.8611111111111112 | 0 |
| 0.8618055555555556 | 0 |
| 0.8624999999999999 | 0 |
| 0.8631944444444444 | 0 |
| 0.8638888888888889 | 0 |
| 0.8645833333333334 | 0 |
| 0.8652777777777777 | 0 |
| 0.8659722222222223 | 0 |
| 0.8666666666666667 | 0 |
| 0.8673611111111111 | 0 |
| 0.8680555555555555 | 0 |
| 0.86875 | 0 |
| 0.8694444444444445 | 0 |
| 0.8701388888888889 | 0 |
| 0.8708333333333332 | 0 |
| 0.8715277777777778 | 0 |
| 0.8722222222222222 | 0 |
| 0.8729166666666667 | 0 |
| 0.873611111111111 | 0 |
| 0.8743055555555556 | 0 |
| 0.875 | 0 |
| 0.8756944444444444 | 0 |
| 0.876388888888889 | 0 |
| 0.8770833333333333 | 0 |
| 0.8777777777777778 | 0 |
| 0.8784722222222222 | 0 |
| 0.8791666666666668 | 0 |
| 0.8798611111111111 | 0 |
| 0.8805555555555555 | 0 |
| 0.88125 | 0 |
| 0.8819444444444445 | 0 |
| 0.8826388888888889 | 0 |
| 0.8833333333333333 | 0 |
| 0.8840277777777777 | 0 |
| 0.8847222222222223 | 0 |
| 0.8854166666666666 | 0 |
| 0.8861111111111111 | 0 |
| 0.8868055555555556 | 0 |
| 0.8875000000000001 | 0 |
| 0.8881944444444444 | 0 |
| 0.8888888888888888 | 0 |
| 0.8895833333333334 | 0 |
| 0.8902777777777778 | 0 |
| 0.8909722222222222 | 0 |
| 0.8916666666666666 | 0 |
| 0.8923611111111112 | 0 |
| 0.8930555555555556 | 0 |
| 0.8937499999999999 | 0 |
| 0.8944444444444444 | 0 |
| 0.8951388888888889 | 0 |
| 0.8958333333333334 | 0 |
| 0.8965277777777777 | 0 |
| 0.8972222222222223 | 0 |
| 0.8979166666666667 | 0 |
| 0.8986111111111111 | 0 |
| 0.8993055555555555 | 0 |
| 0.9 | 0 |
| 0.9006944444444445 | 0 |
| 0.9013888888888889 | 0 |
| 0.9020833333333332 | 0 |
| 0.9027777777777778 | 0 |
| 0.9034722222222222 | 0 |
| 0.9041666666666667 | 0 |
| 0.904861111111111 | 0 |
| 0.9055555555555556 | 0 |
| 0.90625 | 0 |
| 0.9069444444444444 | 0 |
| 0.907638888888889 | 0 |
| 0.9083333333333333 | 0 |
| 0.9090277777777778 | 0 |
| 0.9097222222222222 | 0 |
| 0.9104166666666668 | 0 |
| 0.9111111111111111 | 0 |
| 0.9118055555555555 | 0 |
| 0.9125 | 0 |
| 0.9131944444444445 | 0 |
| 0.9138888888888889 | 0 |
| 0.9145833333333333 | 0 |
| 0.9152777777777777 | 0 |
| 0.9159722222222223 | 0 |
| 0.9166666666666666 | 0 |
| 0.9173611111111111 | 0 |
| 0.9180555555555556 | 0 |
| 0.9187500000000001 | 0 |
| 0.9194444444444444 | 0 |
| 0.9201388888888888 | 0 |
| 0.9208333333333334 | 0 |
| 0.9215277777777778 | 0 |
| 0.9222222222222222 | 0 |
| 0.9229166666666666 | 0 |
| 0.9236111111111112 | 0 |
| 0.9243055555555556 | 0 |
| 0.9249999999999999 | 0 |
| 0.9256944444444444 | 0 |
| 0.9263888888888889 | 0 |
| 0.9270833333333334 | 0 |
| 0.9277777777777777 | 0 |
| 0.9284722222222223 | 0 |
| 0.9291666666666667 | 0 |
| 0.9298611111111111 | 0 |
| 0.9305555555555555 | 0 |
| 0.93125 | 0 |
| 0.9319444444444445 | 0 |
| 0.9326388888888889 | 0 |
| 0.9333333333333332 | 0 |
| 0.9340277777777778 | 0 |
| 0.9347222222222222 | 0 |
| 0.9354166666666667 | 0 |
| 0.936111111111111 | 0 |
| 0.9368055555555556 | 0 |
| 0.9375 | 0 |
| 0.9381944444444444 | 0 |
| 0.938888888888889 | 0 |
| 0.9395833333333333 | 0 |
| 0.9402777777777778 | 0 |
| 0.9409722222222222 | 0 |
| 0.9416666666666668 | 0 |
| 0.9423611111111111 | 0 |
| 0.9430555555555555 | 0 |
| 0.94375 | 0 |
| 0.9444444444444445 | 0 |
| 0.9451388888888889 | 0 |
| 0.9458333333333333 | 0 |
| 0.9465277777777777 | 0 |
| 0.9472222222222223 | 0 |
| 0.9479166666666666 | 0 |
| 0.9486111111111111 | 0 |
| 0.9493055555555556 | 0 |
| 0.9500000000000001 | 0 |
| 0.9506944444444444 | 0 |
| 0.9513888888888888 | 0 |
| 0.9520833333333334 | 0 |
| 0.9527777777777778 | 0 |
| 0.9534722222222222 | 0 |
| 0.9541666666666666 | 0 |
| 0.9548611111111112 | 0 |
| 0.9555555555555556 | 0 |
| 0.9562499999999999 | 0 |
| 0.9569444444444444 | 0 |
| 0.9576388888888889 | 0 |
| 0.9583333333333334 | 0 |
| 0.9590277777777777 | 0 |
| 0.9597222222222223 | 0 |
| 0.9604166666666667 | 0 |
| 0.9611111111111111 | 0 |
| 0.9618055555555555 | 0 |
| 0.9625 | 0 |
| 0.9631944444444445 | 0 |
| 0.9638888888888889 | 0 |
| 0.9645833333333332 | 0 |
| 0.9652777777777778 | 0 |
| 0.9659722222222222 | 0 |
| 0.9666666666666667 | 0 |
| 0.967361111111111 | 0 |
| 0.9680555555555556 | 0 |
| 0.96875 | 0 |
| 0.9694444444444444 | 0 |
| 0.970138888888889 | 0 |
| 0.9708333333333333 | 0 |
| 0.9715277777777778 | 0 |
| 0.9722222222222222 | 0 |
| 0.9729166666666668 | 0 |
| 0.9736111111111111 | 0 |
| 0.9743055555555555 | 0 |
| 0.975 | 0 |
| 0.9756944444444445 | 0 |
| 0.9763888888888889 | 0 |
| 0.9770833333333333 | 0 |
| 0.9777777777777777 | 0 |
| 0.9784722222222223 | 0 |
| 0.9791666666666666 | 0 |
| 0.9798611111111111 | 0 |
| 0.9805555555555556 | 0 |
| 0.9812500000000001 | 0 |
| 0.9819444444444444 | 0 |
| 0.9826388888888888 | 0 |
| 0.9833333333333334 | 0 |
| 0.9840277777777778 | 0 |
| 0.9847222222222222 | 0 |
| 0.9854166666666666 | 0 |
| 0.9861111111111112 | 0 |
| 0.9868055555555556 | 0 |
| 0.9874999999999999 | 0 |
| 0.9881944444444444 | 0 |
| 0.9888888888888889 | 0 |
| 0.9895833333333334 | 0 |
| 0.9902777777777777 | 0 |
| 0.9909722222222223 | 0 |
| 0.9916666666666667 | 0 |
| 0.9923611111111111 | 0 |
| 0.9930555555555555 | 0 |
| 0.99375 | 0 |
| 0.9944444444444445 | 0 |
| 0.9951388888888889 | 0 |
| 0.9958333333333332 | 0 |
| 0.9965277777777778 | 0 |
| 0.9972222222222222 | 0 |
| 0.9979166666666667 | 0 |
| 0.998611111111111 | 0 |
| 0.9993055555555556 | 0 |